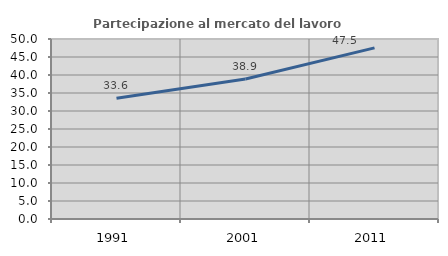
| Category | Partecipazione al mercato del lavoro  femminile |
|---|---|
| 1991.0 | 33.561 |
| 2001.0 | 38.897 |
| 2011.0 | 47.536 |